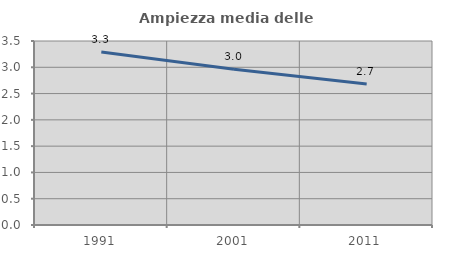
| Category | Ampiezza media delle famiglie |
|---|---|
| 1991.0 | 3.289 |
| 2001.0 | 2.963 |
| 2011.0 | 2.683 |